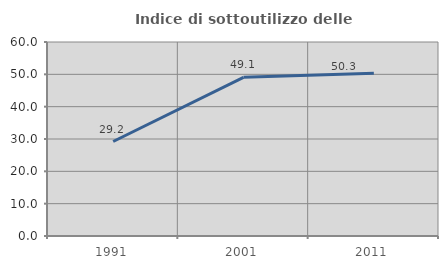
| Category | Indice di sottoutilizzo delle abitazioni  |
|---|---|
| 1991.0 | 29.219 |
| 2001.0 | 49.085 |
| 2011.0 | 50.325 |